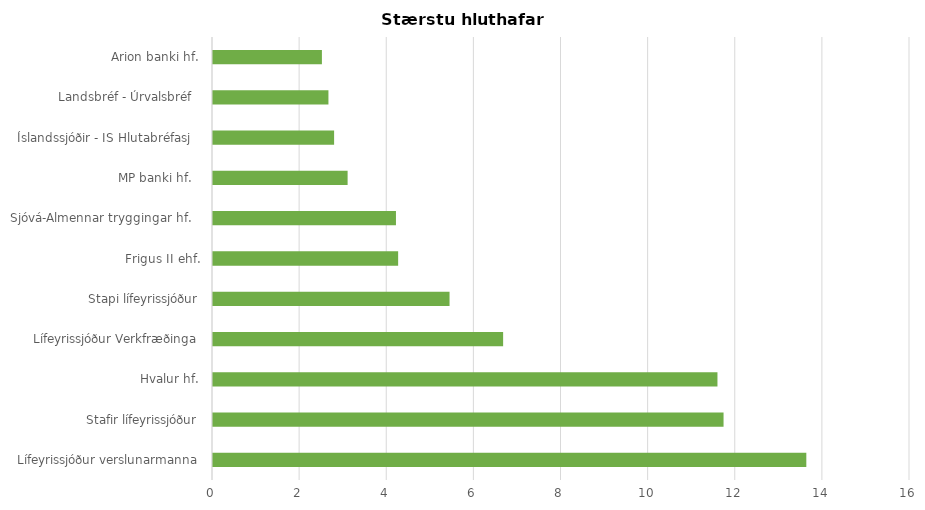
| Category | Series 0 |
|---|---|
| Lífeyrissjóður verslunarmanna | 13.62 |
| Stafir lífeyrissjóður | 11.72 |
| Hvalur hf. | 11.58 |
| Lífeyrissjóður Verkfræðinga | 6.66 |
| Stapi lífeyrissjóður | 5.43 |
| Frigus II ehf. | 4.25 |
| Sjóvá-Almennar tryggingar hf.   | 4.2 |
| MP banki hf.   | 3.09 |
| Íslandssjóðir - IS Hlutabréfasj   | 2.78 |
| Landsbréf - Úrvalsbréf   | 2.65 |
| Arion banki hf. | 2.5 |